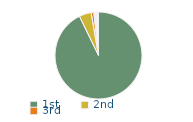
| Category | Series 0 |
|---|---|
| 1st | 92.8 |
| 2nd | 4.5 |
| 3rd | 1 |